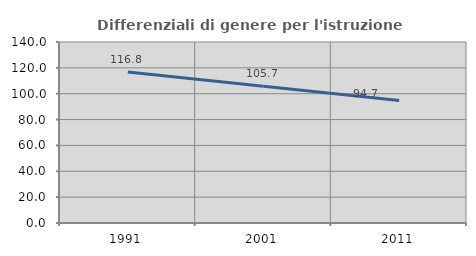
| Category | Differenziali di genere per l'istruzione superiore |
|---|---|
| 1991.0 | 116.783 |
| 2001.0 | 105.698 |
| 2011.0 | 94.715 |